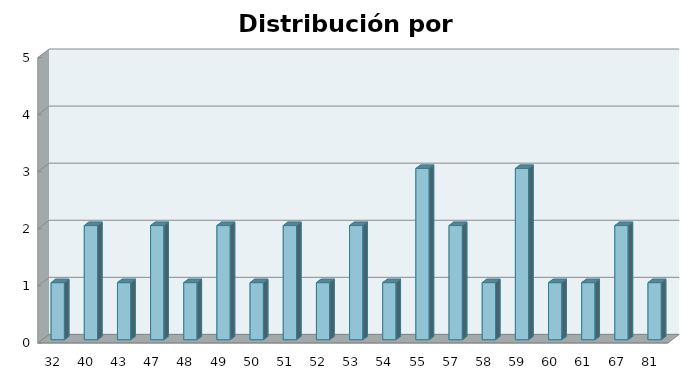
| Category | Series 1 |
|---|---|
| 32.0 | 1 |
| 40.0 | 2 |
| 43.0 | 1 |
| 47.0 | 2 |
| 48.0 | 1 |
| 49.0 | 2 |
| 50.0 | 1 |
| 51.0 | 2 |
| 52.0 | 1 |
| 53.0 | 2 |
| 54.0 | 1 |
| 55.0 | 3 |
| 57.0 | 2 |
| 58.0 | 1 |
| 59.0 | 3 |
| 60.0 | 1 |
| 61.0 | 1 |
| 67.0 | 2 |
| 81.0 | 1 |